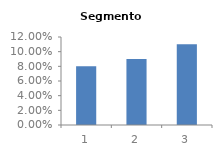
| Category | Segmento 3 |
|---|---|
| 0 | 0.08 |
| 1 | 0.09 |
| 2 | 0.11 |